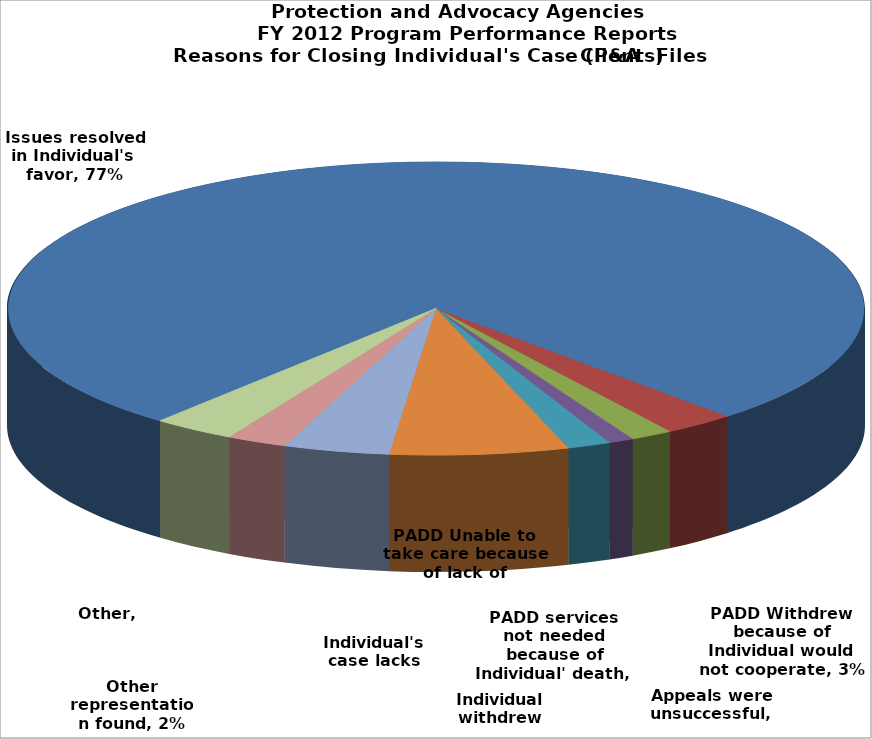
| Category | Series 0 |
|---|---|
| Issues resolved in Individual's favor | 0.77 |
| PADD Withdrew because of Individual would not cooperate | 0.027 |
| Appeals were unsuccessful | 0.016 |
| PADD services not needed because of Individual' death, relocation | 0.009 |
| PADD Unable to take care because of lack of resources | 0.016 |
| Individual withdrew complaints | 0.067 |
| Individual's case lacks merit | 0.04 |
| Other representation found | 0.023 |
| Other | 0.031 |